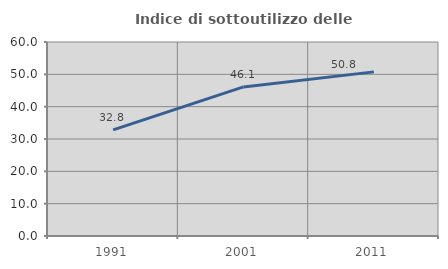
| Category | Indice di sottoutilizzo delle abitazioni  |
|---|---|
| 1991.0 | 32.838 |
| 2001.0 | 46.108 |
| 2011.0 | 50.758 |